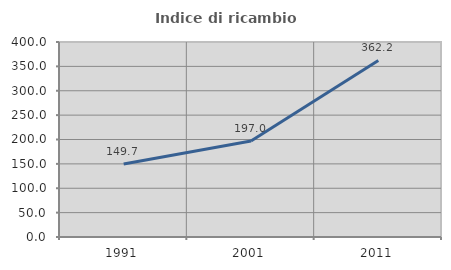
| Category | Indice di ricambio occupazionale  |
|---|---|
| 1991.0 | 149.711 |
| 2001.0 | 197.015 |
| 2011.0 | 362.185 |